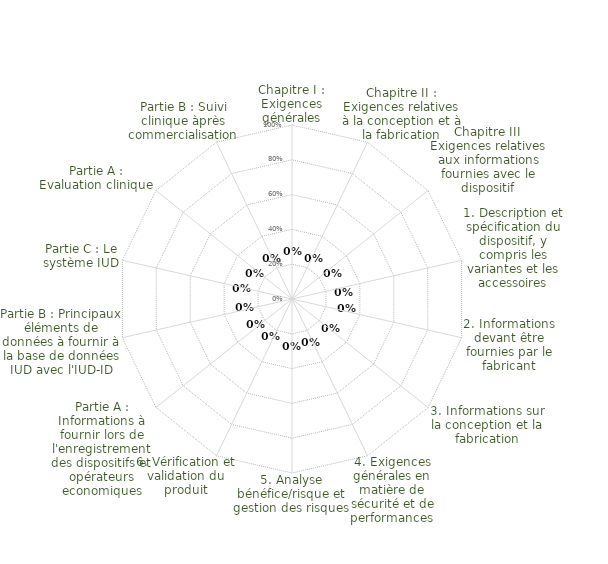
| Category | Sous-parties des Annexes |
|---|---|
| Chapitre I : Exigences générales | 0 |
| Chapitre II : Exigences relatives à la conception et à la fabrication | 0 |
| Chapitre III  Exigences relatives aux informations fournies avec le dispositif | 0 |
| 1. Description et spécification du dispositif, y compris les variantes et les accessoires | 0 |
| 2. Informations devant être fournies par le fabricant | 0 |
| 3. Informations sur la conception et la fabrication | 0 |
| 4. Exigences générales en matière de sécurité et de performances | 0 |
| 5. Analyse bénéfice/risque et gestion des risques | 0 |
| 6. Vérification et validation du produit | 0 |
| Partie A : Informations à fournir lors de l'enregistrement des dispositifs et opérateurs economiques | 0 |
| Partie B : Principaux éléments de données à fournir à la base de données IUD avec l'IUD-ID | 0 |
| Partie C : Le système IUD | 0 |
| Partie A : Evaluation clinique | 0 |
| Partie B : Suivi clinique àprès commercialisation | 0 |